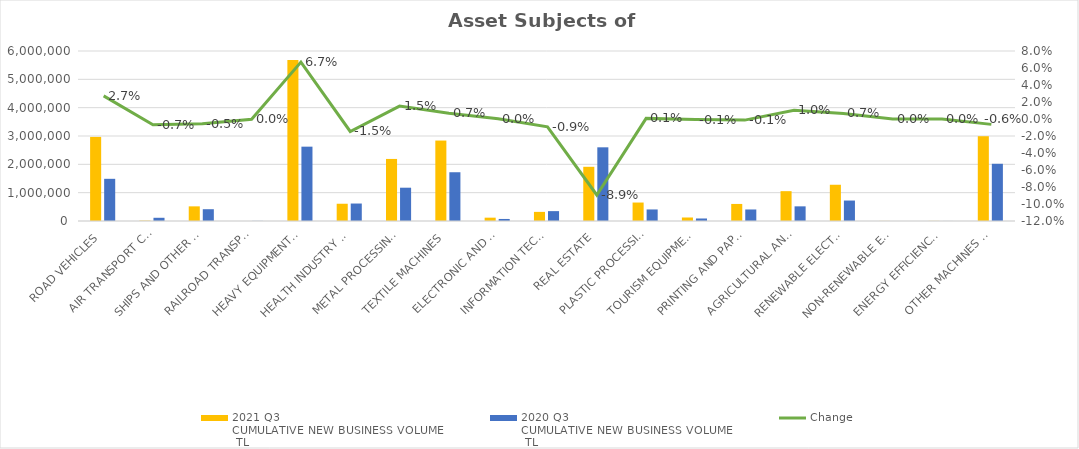
| Category | 2021 Q3 
CUMULATIVE NEW BUSINESS VOLUME
 TL | 2020 Q3 
CUMULATIVE NEW BUSINESS VOLUME
 TL |
|---|---|---|
| ROAD VEHICLES | 2967853.993 | 1488810.758 |
| AIR TRANSPORT CONVEYANCE | 12757 | 113499.207 |
| SHIPS AND OTHER SEA-GOING VESSELS | 516931.098 | 416188.616 |
| RAILROAD TRANSPORT VEHICLES | 293 | 3781 |
| HEAVY EQUIPMENT AND CONSTRUCTION MACHINERY | 5680976.457 | 2623689.067 |
| HEALTH INDUSTRY AND AESTHETIC INSTRUMENTS | 609011.559 | 616710.87 |
| METAL PROCESSING MACHINE | 2190474.218 | 1175092.775 |
| TEXTILE MACHINES | 2839234.288 | 1721055.689 |
| ELECTRONIC AND OPTICAL DEVICES | 117560.782 | 72000.007 |
| INFORMATION TECHNOLOGIES AND OFFICE SYSTEMS | 321937.527 | 348593.729 |
| REAL ESTATE | 1912992.305 | 2600656.177 |
| PLASTIC PROCESSING MACHINES | 651604.318 | 407600.657 |
| TOURISM EQUIPMENT | 123802.974 | 88821.705 |
| PRINTING AND PAPER PROCESSING MACHINES | 602172.452 | 406822.803 |
| AGRICULTURAL AND LIVESTOCK FARMING MACHINES | 1053192.501 | 517190.887 |
| RENEWABLE ELECTRICITY GENERATION | 1279280.813 | 721871.102 |
| NON-RENEWABLE ELECTRIC ENERGY GENERATION | 2857 | 0 |
| ENERGY EFFICIENCY EQUIPMENT | 3661.684 | 1202.74 |
| OTHER MACHINES AND EQUIPMENT | 2992170.921 | 2019603.435 |